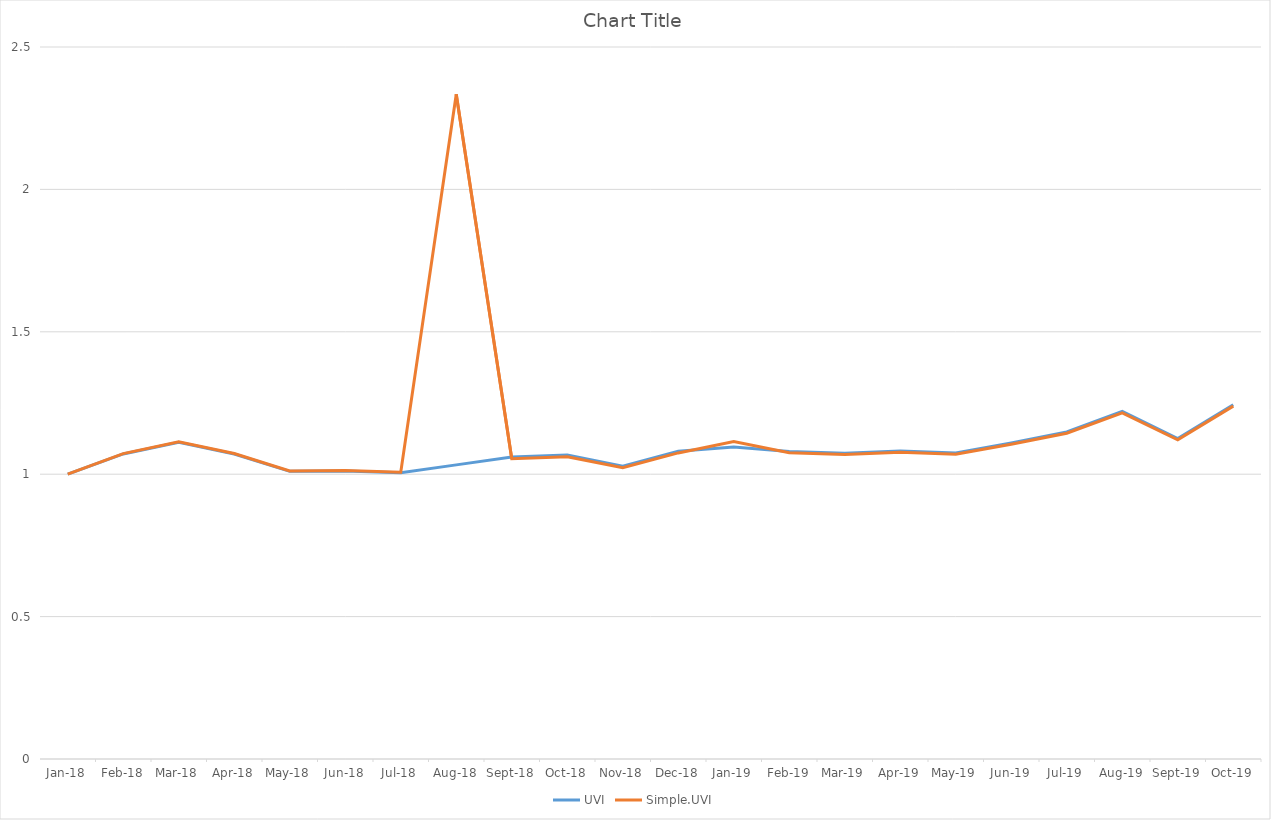
| Category | UVI | Simple.UVI |
|---|---|---|
| 2018-01-01 | 1 | 1 |
| 2018-02-01 | 1.071 | 1.072 |
| 2018-03-01 | 1.112 | 1.114 |
| 2018-04-01 | 1.071 | 1.073 |
| 2018-05-01 | 1.01 | 1.011 |
| 2018-06-01 | 1.011 | 1.013 |
| 2018-07-01 | 1.005 | 1.007 |
| 2018-08-01 | 1.033 | 2.334 |
| 2018-09-01 | 1.06 | 1.054 |
| 2018-10-01 | 1.068 | 1.062 |
| 2018-11-01 | 1.028 | 1.022 |
| 2018-12-01 | 1.081 | 1.075 |
| 2019-01-01 | 1.096 | 1.114 |
| 2019-02-01 | 1.08 | 1.075 |
| 2019-03-01 | 1.073 | 1.069 |
| 2019-04-01 | 1.082 | 1.077 |
| 2019-05-01 | 1.075 | 1.07 |
| 2019-06-01 | 1.11 | 1.105 |
| 2019-07-01 | 1.148 | 1.144 |
| 2019-08-01 | 1.22 | 1.215 |
| 2019-09-01 | 1.125 | 1.121 |
| 2019-10-01 | 1.244 | 1.239 |